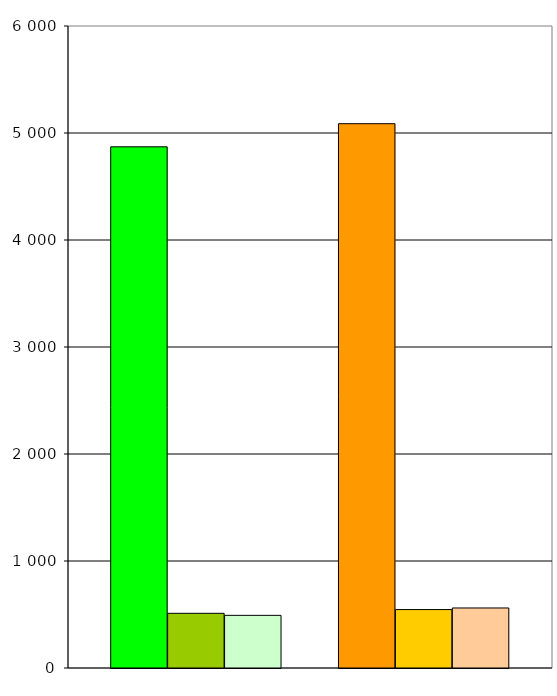
| Category | Series 0 | Series 1 | Series 2 | Series 3 | Series 4 | Series 5 | Series 6 |
|---|---|---|---|---|---|---|---|
| 0 | 4871 | 511 | 492 |  | 5087 | 546 | 561 |